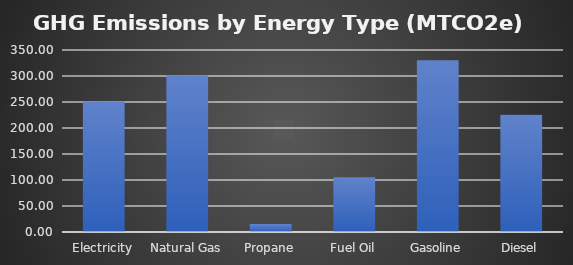
| Category | GHG Emissions (tons) |
|---|---|
| Electricity | 250.971 |
| Natural Gas | 301.305 |
| Propane | 15.234 |
| Fuel Oil | 105.498 |
| Gasoline | 330.233 |
| Diesel | 225.375 |